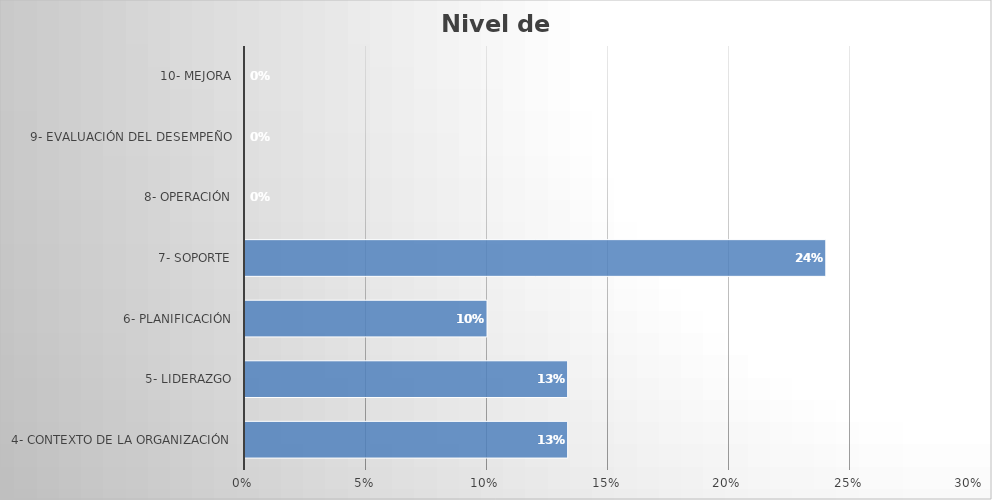
| Category | Series 0 |
|---|---|
| 4- Contexto de la organización | 0.133 |
| 5- Liderazgo | 0.133 |
| 6- Planificación | 0.1 |
| 7- Soporte | 0.24 |
| 8- Operación | 0 |
| 9- Evaluación del desempeño | 0 |
| 10- Mejora | 0 |